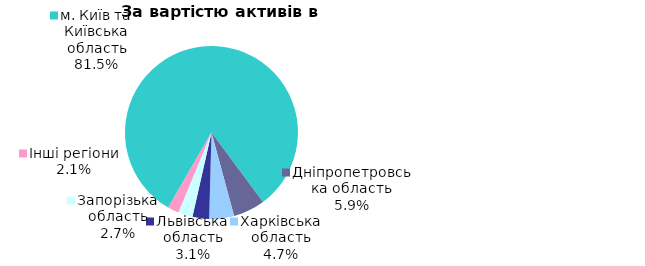
| Category | Series 0 |
|---|---|
| м. Київ та Київська область | 0.815 |
| Дніпропетровська область | 0.059 |
| Харківська область | 0.046 |
| Львівська область | 0.031 |
| Запорізька область | 0.027 |
| Інші регіони | 0.021 |